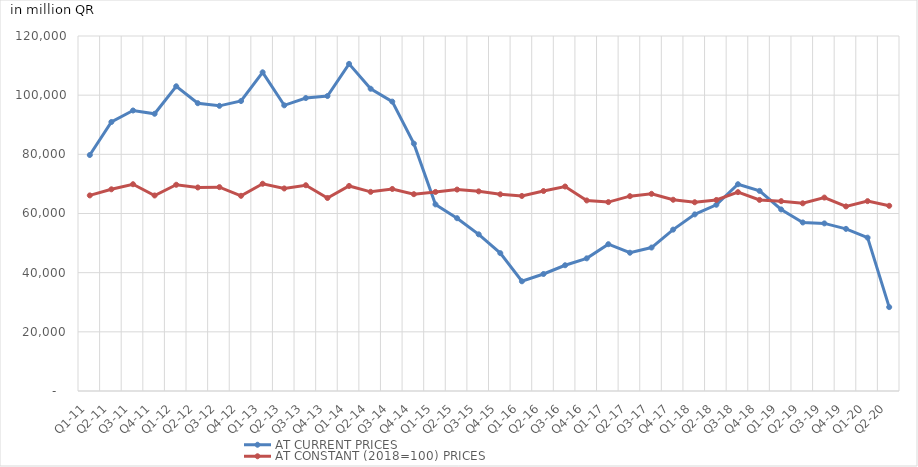
| Category | AT CURRENT PRICES | AT CONSTANT (2018=100) PRICES |
|---|---|---|
| Q1-11 | 79762.26 | 66115.635 |
| Q2-11 | 90934.534 | 68178.594 |
| Q3-11 | 94819.673 | 69888.529 |
| Q4-11 | 93710.543 | 66091.928 |
| Q1-12 | 103001.756 | 69713.748 |
| Q2-12 | 97282.582 | 68797.152 |
| Q3-12 | 96392.279 | 68911.805 |
| Q4-12 | 98020.285 | 65981.471 |
| Q1-13 | 107727.107 | 70051.709 |
| Q2-13 | 96563.811 | 68461.367 |
| Q3-13 | 99032.565 | 69555.177 |
| Q4-13 | 99707.049 | 65247.393 |
| Q1-14 | 110580.467 | 69308.867 |
| Q2-14 | 102169.527 | 67321.129 |
| Q3-14 | 97822.003 | 68292.762 |
| Q4-14 | 83617.712 | 66529.489 |
| Q1-15 | 63078.037 | 67287.655 |
| Q2-15 | 58407.079 | 68087.858 |
| Q3-15 | 52959.132 | 67481.844 |
| Q4-15 | 46597.085 | 66485.266 |
| Q1-16 | 37086.987 | 65926.21 |
| Q2-16 | 39550.427 | 67602.59 |
| Q3-16 | 42506.578 | 69119.923 |
| Q4-16 | 44839.556 | 64412.462 |
| Q1-17 | 49622.542 | 63855.238 |
| Q2-17 | 46742.453 | 65861.865 |
| Q3-17 | 48489.288 | 66647.955 |
| Q4-17 | 54550.908 | 64648.766 |
| Q1-18 | 59700.368 | 63803.741 |
| Q2-18 | 62954.883 | 64573.499 |
| Q3-18 | 69897.859 | 67222.372 |
| Q4-18 | 67644.564 | 64598.063 |
| Q1-19 | 61367.668 | 64178.48 |
| Q2-19 | 56973.562 | 63448.517 |
| Q3-19 | 56653.698 | 65382.493 |
| Q4-19 | 54807.721 | 62399.014 |
| Q1-20 | 51838.655 | 64178.215 |
| Q2-20 | 28361.846 | 62600.438 |